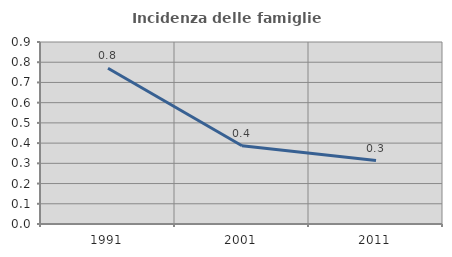
| Category | Incidenza delle famiglie numerose |
|---|---|
| 1991.0 | 0.77 |
| 2001.0 | 0.387 |
| 2011.0 | 0.314 |